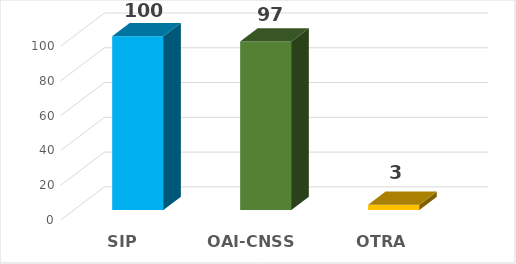
| Category | Series 0 |
|---|---|
| SIP | 100 |
| OAI-CNSS | 97 |
| OTRA ENTIDAD | 3 |